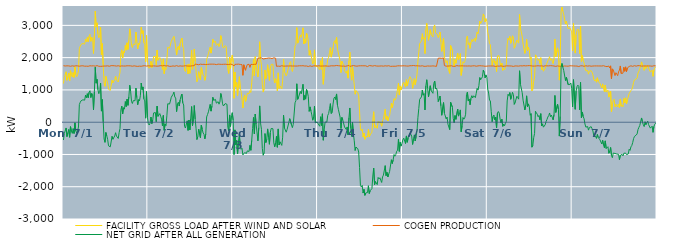
| Category | FACILITY GROSS LOAD AFTER WIND AND SOLAR | COGEN PRODUCTION | NET GRID AFTER ALL GENERATION |
|---|---|---|---|
|  Mon  7/1 | 1198 | 1751 | -553 |
|  Mon  7/1 | 1385 | 1738 | -353 |
|  Mon  7/1 | 1361 | 1741 | -380 |
|  Mon  7/1 | 1562 | 1741 | -179 |
|  Mon  7/1 | 1299 | 1746 | -447 |
|  Mon  7/1 | 1410 | 1731 | -321 |
|  Mon  7/1 | 1518 | 1744 | -226 |
|  Mon  7/1 | 1281 | 1748 | -467 |
|  Mon  7/1 | 1595 | 1733 | -138 |
|  Mon  7/1 | 1474 | 1747 | -273 |
|  Mon  7/1 | 1399 | 1746 | -347 |
|  Mon  7/1 | 1538 | 1738 | -200 |
|  Mon  7/1 | 1386 | 1736 | -350 |
|  Mon  7/1 | 1716 | 1736 | -20 |
|  Mon  7/1 | 1476 | 1748 | -272 |
|  Mon  7/1 | 1410 | 1746 | -336 |
|  Mon  7/1 | 1473 | 1745 | -272 |
|  Mon  7/1 | 1589 | 1739 | -150 |
|  Mon  7/1 | 2279 | 1734 | 545 |
|  Mon  7/1 | 2356 | 1739 | 617 |
|  Mon  7/1 | 2411 | 1745 | 666 |
|  Mon  7/1 | 2425 | 1754 | 671 |
|  Mon  7/1 | 2440 | 1747 | 693 |
|  Mon  7/1 | 2423 | 1740 | 683 |
|  Mon  7/1 | 2417 | 1735 | 682 |
|  Mon  7/1 | 2572 | 1735 | 837 |
|  Mon  7/1 | 2494 | 1736 | 758 |
|  Mon  7/1 | 2624 | 1741 | 883 |
|  Mon  7/1 | 2492 | 1732 | 760 |
|  Mon  7/1 | 2660 | 1734 | 926 |
|  Mon  7/1 | 2722 | 1748 | 974 |
|  Mon  7/1 | 2504 | 1742 | 762 |
|  Mon  7/1 | 2636 | 1743 | 893 |
|  Mon  7/1 | 2586 | 1743 | 843 |
|  Mon  7/1 | 2130 | 1747 | 383 |
|  Mon  7/1 | 2696 | 1750 | 946 |
|  Mon  7/1 | 3440 | 1736 | 1704 |
|  Mon  7/1 | 2952 | 1743 | 1209 |
|  Mon  7/1 | 3079 | 1753 | 1326 |
|  Mon  7/1 | 2740 | 1733 | 1007 |
|  Mon  7/1 | 2614 | 1732 | 882 |
|  Mon  7/1 | 2675 | 1753 | 922 |
|  Mon  7/1 | 2944 | 1730 | 1214 |
|  Mon  7/1 | 2086 | 1743 | 343 |
|  Mon  7/1 | 2435 | 1734 | 701 |
|  Mon  7/1 | 1758 | 1748 | 10 |
|  Mon  7/1 | 1218 | 1740 | -522 |
|  Mon  7/1 | 1112 | 1737 | -625 |
|  Mon  7/1 | 1420 | 1740 | -320 |
|  Mon  7/1 | 1305 | 1728 | -423 |
|  Mon  7/1 | 1215 | 1746 | -531 |
|  Mon  7/1 | 1019 | 1751 | -732 |
|  Mon  7/1 | 1001 | 1733 | -732 |
|  Mon  7/1 | 985 | 1748 | -763 |
|  Mon  7/1 | 998 | 1752 | -754 |
|  Mon  7/1 | 1300 | 1740 | -440 |
|  Mon  7/1 | 1222 | 1751 | -529 |
|  Mon  7/1 | 1217 | 1738 | -521 |
|  Mon  7/1 | 1322 | 1747 | -425 |
|  Mon  7/1 | 1422 | 1748 | -326 |
|  Mon  7/1 | 1308 | 1738 | -430 |
|  Mon  7/1 | 1297 | 1742 | -445 |
|  Mon  7/1 | 1245 | 1749 | -504 |
|  Mon  7/1 | 1421 | 1746 | -325 |
|  Mon  7/1 | 1540 | 1734 | -194 |
|  Mon  7/1 | 2126 | 1745 | 381 |
|  Mon  7/1 | 2241 | 1744 | 497 |
|  Mon  7/1 | 1992 | 1732 | 260 |
|  Mon  7/1 | 2189 | 1740 | 449 |
|  Mon  7/1 | 2144 | 1741 | 403 |
|  Mon  7/1 | 2379 | 1740 | 639 |
|  Mon  7/1 | 2231 | 1748 | 483 |
|  Mon  7/1 | 2460 | 1747 | 713 |
|  Mon  7/1 | 2255 | 1733 | 522 |
|  Mon  7/1 | 2534 | 1747 | 787 |
|  Mon  7/1 | 2892 | 1747 | 1145 |
|  Mon  7/1 | 2704 | 1745 | 959 |
|  Mon  7/1 | 2376 | 1733 | 643 |
|  Mon  7/1 | 2313 | 1734 | 579 |
|  Mon  7/1 | 2419 | 1751 | 668 |
|  Mon  7/1 | 2389 | 1746 | 643 |
|  Mon  7/1 | 2408 | 1742 | 666 |
|  Mon  7/1 | 2794 | 1736 | 1058 |
|  Mon  7/1 | 2499 | 1739 | 760 |
|  Mon  7/1 | 2269 | 1729 | 540 |
|  Mon  7/1 | 2443 | 1745 | 698 |
|  Mon  7/1 | 2397 | 1737 | 660 |
|  Mon  7/1 | 2565 | 1747 | 818 |
|  Mon  7/1 | 2944 | 1732 | 1212 |
|  Mon  7/1 | 2748 | 1738 | 1010 |
|  Mon  7/1 | 2836 | 1744 | 1092 |
|  Mon  7/1 | 2466 | 1743 | 723 |
|  Mon  7/1 | 2411 | 1751 | 660 |
|  Mon  7/1 | 1868 | 1744 | 124 |
|  Mon  7/1 | 2686 | 1737 | 949 |
|  Mon  7/1 | 1907 | 1750 | 157 |
|  Tue  7/2 | 1706 | 1747 | -41 |
|  Tue  7/2 | 1673 | 1761 | -88 |
|  Tue  7/2 | 1711 | 1741 | -30 |
|  Tue  7/2 | 1887 | 1727 | 160 |
|  Tue  7/2 | 1695 | 1739 | -44 |
|  Tue  7/2 | 1803 | 1736 | 67 |
|  Tue  7/2 | 2030 | 1744 | 286 |
|  Tue  7/2 | 2060 | 1760 | 300 |
|  Tue  7/2 | 2039 | 1740 | 299 |
|  Tue  7/2 | 1767 | 1752 | 15 |
|  Tue  7/2 | 2234 | 1736 | 498 |
|  Tue  7/2 | 1917 | 1738 | 179 |
|  Tue  7/2 | 1911 | 1740 | 171 |
|  Tue  7/2 | 2005 | 1739 | 266 |
|  Tue  7/2 | 1939 | 1752 | 187 |
|  Tue  7/2 | 1841 | 1747 | 94 |
|  Tue  7/2 | 1634 | 1745 | -111 |
|  Tue  7/2 | 1962 | 1753 | 209 |
|  Tue  7/2 | 1503 | 1755 | -252 |
|  Tue  7/2 | 1689 | 1744 | -55 |
|  Tue  7/2 | 1634 | 1742 | -108 |
|  Tue  7/2 | 1924 | 1727 | 197 |
|  Tue  7/2 | 2321 | 1749 | 572 |
|  Tue  7/2 | 2318 | 1745 | 573 |
|  Tue  7/2 | 2291 | 1730 | 561 |
|  Tue  7/2 | 2393 | 1740 | 653 |
|  Tue  7/2 | 2505 | 1732 | 773 |
|  Tue  7/2 | 2525 | 1750 | 775 |
|  Tue  7/2 | 2608 | 1743 | 865 |
|  Tue  7/2 | 2662 | 1730 | 932 |
|  Tue  7/2 | 2514 | 1734 | 780 |
|  Tue  7/2 | 2493 | 1746 | 747 |
|  Tue  7/2 | 2080 | 1752 | 328 |
|  Tue  7/2 | 2313 | 1743 | 570 |
|  Tue  7/2 | 2351 | 1732 | 619 |
|  Tue  7/2 | 2242 | 1742 | 500 |
|  Tue  7/2 | 2435 | 1745 | 690 |
|  Tue  7/2 | 2544 | 1738 | 806 |
|  Tue  7/2 | 2608 | 1737 | 871 |
|  Tue  7/2 | 2337 | 1738 | 599 |
|  Tue  7/2 | 2273 | 1740 | 533 |
|  Tue  7/2 | 1612 | 1742 | -130 |
|  Tue  7/2 | 1568 | 1749 | -181 |
|  Tue  7/2 | 1542 | 1734 | -192 |
|  Tue  7/2 | 1783 | 1741 | 42 |
|  Tue  7/2 | 1498 | 1751 | -253 |
|  Tue  7/2 | 1805 | 1738 | 67 |
|  Tue  7/2 | 1514 | 1752 | -238 |
|  Tue  7/2 | 1853 | 1739 | 114 |
|  Tue  7/2 | 2233 | 1749 | 484 |
|  Tue  7/2 | 1638 | 1749 | -111 |
|  Tue  7/2 | 1825 | 1734 | 91 |
|  Tue  7/2 | 2267 | 1751 | 516 |
|  Tue  7/2 | 1897 | 1799 | 98 |
|  Tue  7/2 | 1603 | 1792 | -189 |
|  Tue  7/2 | 1254 | 1792 | -538 |
|  Tue  7/2 | 1342 | 1790 | -448 |
|  Tue  7/2 | 1566 | 1780 | -214 |
|  Tue  7/2 | 1580 | 1793 | -213 |
|  Tue  7/2 | 1317 | 1798 | -481 |
|  Tue  7/2 | 1699 | 1790 | -91 |
|  Tue  7/2 | 1569 | 1790 | -221 |
|  Tue  7/2 | 1458 | 1793 | -335 |
|  Tue  7/2 | 1418 | 1794 | -376 |
|  Tue  7/2 | 1296 | 1813 | -517 |
|  Tue  7/2 | 1418 | 1785 | -367 |
|  Tue  7/2 | 1944 | 1782 | 162 |
|  Tue  7/2 | 2028 | 1791 | 237 |
|  Tue  7/2 | 2122 | 1801 | 321 |
|  Tue  7/2 | 2133 | 1797 | 336 |
|  Tue  7/2 | 2325 | 1775 | 550 |
|  Tue  7/2 | 2140 | 1798 | 342 |
|  Tue  7/2 | 2294 | 1789 | 505 |
|  Tue  7/2 | 2570 | 1798 | 772 |
|  Tue  7/2 | 2475 | 1797 | 678 |
|  Tue  7/2 | 2499 | 1796 | 703 |
|  Tue  7/2 | 2503 | 1798 | 705 |
|  Tue  7/2 | 2374 | 1784 | 590 |
|  Tue  7/2 | 2372 | 1795 | 577 |
|  Tue  7/2 | 2434 | 1798 | 636 |
|  Tue  7/2 | 2341 | 1783 | 558 |
|  Tue  7/2 | 2422 | 1795 | 627 |
|  Tue  7/2 | 2683 | 1794 | 889 |
|  Tue  7/2 | 2571 | 1791 | 780 |
|  Tue  7/2 | 2350 | 1780 | 570 |
|  Tue  7/2 | 2295 | 1794 | 501 |
|  Tue  7/2 | 2308 | 1788 | 520 |
|  Tue  7/2 | 2373 | 1797 | 576 |
|  Tue  7/2 | 2342 | 1793 | 549 |
|  Tue  7/2 | 2344 | 1791 | 553 |
|  Tue  7/2 | 1640 | 1798 | -158 |
|  Tue  7/2 | 1510 | 1786 | -276 |
|  Tue  7/2 | 2017 | 1793 | 224 |
|  Tue  7/2 | 1667 | 1799 | -132 |
|  Tue  7/2 | 1978 | 1775 | 203 |
|  Tue  7/2 | 2080 | 1786 | 294 |
|  Wed  7/3 | 1863 | 1799 | 64 |
|  Wed  7/3 | 739 | 1742 | -1003 |
|  Wed  7/3 | 1553 | 1791 | -238 |
|  Wed  7/3 | 1091 | 1791 | -700 |
|  Wed  7/3 | 1229 | 1795 | -566 |
|  Wed  7/3 | 824 | 1807 | -983 |
|  Wed  7/3 | 1192 | 1798 | -606 |
|  Wed  7/3 | 1409 | 1787 | -378 |
|  Wed  7/3 | 1055 | 1790 | -735 |
|  Wed  7/3 | 948 | 1788 | -840 |
|  Wed  7/3 | 975 | 1783 | -808 |
|  Wed  7/3 | 439 | 1453 | -1014 |
|  Wed  7/3 | 757 | 1779 | -1022 |
|  Wed  7/3 | 844 | 1786 | -942 |
|  Wed  7/3 | 641 | 1609 | -968 |
|  Wed  7/3 | 740 | 1710 | -970 |
|  Wed  7/3 | 894 | 1784 | -890 |
|  Wed  7/3 | 905 | 1798 | -893 |
|  Wed  7/3 | 887 | 1793 | -906 |
|  Wed  7/3 | 977 | 1696 | -719 |
|  Wed  7/3 | 921 | 1792 | -871 |
|  Wed  7/3 | 1223 | 1787 | -564 |
|  Wed  7/3 | 1590 | 1787 | -197 |
|  Wed  7/3 | 1950 | 1803 | 147 |
|  Wed  7/3 | 1431 | 1793 | -362 |
|  Wed  7/3 | 2028 | 1775 | 253 |
|  Wed  7/3 | 1731 | 1795 | -64 |
|  Wed  7/3 | 1750 | 1793 | -43 |
|  Wed  7/3 | 1401 | 1979 | -578 |
|  Wed  7/3 | 1811 | 1977 | -166 |
|  Wed  7/3 | 2492 | 1987 | 505 |
|  Wed  7/3 | 1945 | 1974 | -29 |
|  Wed  7/3 | 1775 | 1995 | -220 |
|  Wed  7/3 | 1164 | 1977 | -813 |
|  Wed  7/3 | 933 | 1956 | -1023 |
|  Wed  7/3 | 1037 | 1979 | -942 |
|  Wed  7/3 | 1616 | 1969 | -353 |
|  Wed  7/3 | 1348 | 1979 | -631 |
|  Wed  7/3 | 1444 | 1977 | -533 |
|  Wed  7/3 | 1780 | 1988 | -208 |
|  Wed  7/3 | 1523 | 1988 | -465 |
|  Wed  7/3 | 1290 | 1975 | -685 |
|  Wed  7/3 | 1663 | 1984 | -321 |
|  Wed  7/3 | 1791 | 1986 | -195 |
|  Wed  7/3 | 1781 | 1971 | -190 |
|  Wed  7/3 | 1793 | 1996 | -203 |
|  Wed  7/3 | 1351 | 1995 | -644 |
|  Wed  7/3 | 1213 | 1976 | -763 |
|  Wed  7/3 | 1349 | 1982 | -633 |
|  Wed  7/3 | 1294 | 1732 | -438 |
|  Wed  7/3 | 969 | 1747 | -778 |
|  Wed  7/3 | 1528 | 1737 | -209 |
|  Wed  7/3 | 1046 | 1753 | -707 |
|  Wed  7/3 | 1121 | 1730 | -609 |
|  Wed  7/3 | 1117 | 1744 | -627 |
|  Wed  7/3 | 1031 | 1750 | -719 |
|  Wed  7/3 | 1281 | 1745 | -464 |
|  Wed  7/3 | 1953 | 1737 | 216 |
|  Wed  7/3 | 1571 | 1750 | -179 |
|  Wed  7/3 | 1556 | 1738 | -182 |
|  Wed  7/3 | 1433 | 1744 | -311 |
|  Wed  7/3 | 1512 | 1741 | -229 |
|  Wed  7/3 | 1511 | 1748 | -237 |
|  Wed  7/3 | 1729 | 1741 | -12 |
|  Wed  7/3 | 1845 | 1736 | 109 |
|  Wed  7/3 | 1876 | 1744 | 132 |
|  Wed  7/3 | 1650 | 1731 | -81 |
|  Wed  7/3 | 1570 | 1740 | -170 |
|  Wed  7/3 | 1676 | 1743 | -67 |
|  Wed  7/3 | 1694 | 1741 | -47 |
|  Wed  7/3 | 2360 | 1759 | 601 |
|  Wed  7/3 | 2405 | 1739 | 666 |
|  Wed  7/3 | 2929 | 1739 | 1190 |
|  Wed  7/3 | 2449 | 1741 | 708 |
|  Wed  7/3 | 2518 | 1741 | 777 |
|  Wed  7/3 | 2544 | 1748 | 796 |
|  Wed  7/3 | 2703 | 1748 | 955 |
|  Wed  7/3 | 2624 | 1747 | 877 |
|  Wed  7/3 | 2751 | 1731 | 1020 |
|  Wed  7/3 | 2924 | 1750 | 1174 |
|  Wed  7/3 | 2425 | 1741 | 684 |
|  Wed  7/3 | 2566 | 1740 | 826 |
|  Wed  7/3 | 2450 | 1736 | 714 |
|  Wed  7/3 | 2758 | 1742 | 1016 |
|  Wed  7/3 | 2680 | 1746 | 934 |
|  Wed  7/3 | 2514 | 1725 | 789 |
|  Wed  7/3 | 2073 | 1739 | 334 |
|  Wed  7/3 | 2220 | 1746 | 474 |
|  Wed  7/3 | 2092 | 1747 | 345 |
|  Wed  7/3 | 1953 | 1729 | 224 |
|  Wed  7/3 | 1803 | 1742 | 61 |
|  Wed  7/3 | 1907 | 1744 | 163 |
|  Wed  7/3 | 2240 | 1745 | 495 |
|  Wed  7/3 | 1725 | 1746 | -21 |
|  Wed  7/3 | 1738 | 1740 | -2 |
|  Wed  7/3 | 1744 | 1740 | 4 |
|  Thu  7/4 | 1741 | 1733 | 8 |
|  Thu  7/4 | 1661 | 1748 | -87 |
|  Thu  7/4 | 1624 | 1751 | -127 |
|  Thu  7/4 | 1907 | 1738 | 169 |
|  Thu  7/4 | 1640 | 1743 | -103 |
|  Thu  7/4 | 2000 | 1740 | 260 |
|  Thu  7/4 | 1175 | 1734 | -559 |
|  Thu  7/4 | 1514 | 1742 | -228 |
|  Thu  7/4 | 1744 | 1741 | 3 |
|  Thu  7/4 | 1745 | 1743 | 2 |
|  Thu  7/4 | 1739 | 1736 | 3 |
|  Thu  7/4 | 1949 | 1736 | 213 |
|  Thu  7/4 | 2010 | 1745 | 265 |
|  Thu  7/4 | 2153 | 1737 | 416 |
|  Thu  7/4 | 2307 | 1733 | 574 |
|  Thu  7/4 | 2016 | 1748 | 268 |
|  Thu  7/4 | 2039 | 1740 | 299 |
|  Thu  7/4 | 2304 | 1745 | 559 |
|  Thu  7/4 | 2484 | 1741 | 743 |
|  Thu  7/4 | 2527 | 1747 | 780 |
|  Thu  7/4 | 2437 | 1736 | 701 |
|  Thu  7/4 | 2632 | 1757 | 875 |
|  Thu  7/4 | 2279 | 1751 | 528 |
|  Thu  7/4 | 2147 | 1750 | 397 |
|  Thu  7/4 | 2117 | 1730 | 387 |
|  Thu  7/4 | 1899 | 1744 | 155 |
|  Thu  7/4 | 1539 | 1735 | -196 |
|  Thu  7/4 | 1885 | 1737 | 148 |
|  Thu  7/4 | 1827 | 1758 | 69 |
|  Thu  7/4 | 1793 | 1738 | 55 |
|  Thu  7/4 | 1593 | 1741 | -148 |
|  Thu  7/4 | 1606 | 1732 | -126 |
|  Thu  7/4 | 1516 | 1744 | -228 |
|  Thu  7/4 | 1598 | 1745 | -147 |
|  Thu  7/4 | 1365 | 1758 | -393 |
|  Thu  7/4 | 1897 | 1760 | 137 |
|  Thu  7/4 | 2169 | 1729 | 440 |
|  Thu  7/4 | 1554 | 1732 | -178 |
|  Thu  7/4 | 1302 | 1742 | -440 |
|  Thu  7/4 | 1732 | 1735 | -3 |
|  Thu  7/4 | 1408 | 1756 | -348 |
|  Thu  7/4 | 1165 | 1742 | -577 |
|  Thu  7/4 | 866 | 1742 | -876 |
|  Thu  7/4 | 977 | 1748 | -771 |
|  Thu  7/4 | 966 | 1736 | -770 |
|  Thu  7/4 | 911 | 1733 | -822 |
|  Thu  7/4 | 819 | 1745 | -926 |
|  Thu  7/4 | 343 | 1748 | -1405 |
|  Thu  7/4 | -219 | 1748 | -1967 |
|  Thu  7/4 | -264 | 1741 | -2005 |
|  Thu  7/4 | -210 | 1748 | -1958 |
|  Thu  7/4 | -462 | 1734 | -2196 |
|  Thu  7/4 | -334 | 1747 | -2081 |
|  Thu  7/4 | -529 | 1738 | -2267 |
|  Thu  7/4 | -447 | 1746 | -2193 |
|  Thu  7/4 | -465 | 1740 | -2205 |
|  Thu  7/4 | -458 | 1723 | -2181 |
|  Thu  7/4 | -217 | 1753 | -1970 |
|  Thu  7/4 | -454 | 1755 | -2209 |
|  Thu  7/4 | -395 | 1728 | -2123 |
|  Thu  7/4 | -377 | 1748 | -2125 |
|  Thu  7/4 | -309 | 1747 | -2056 |
|  Thu  7/4 | 69 | 1738 | -1669 |
|  Thu  7/4 | 324 | 1747 | -1423 |
|  Thu  7/4 | -182 | 1753 | -1935 |
|  Thu  7/4 | -103 | 1736 | -1839 |
|  Thu  7/4 | -98 | 1741 | -1839 |
|  Thu  7/4 | -192 | 1743 | -1935 |
|  Thu  7/4 | 25 | 1737 | -1712 |
|  Thu  7/4 | -20 | 1738 | -1758 |
|  Thu  7/4 | 18 | 1740 | -1722 |
|  Thu  7/4 | -52 | 1750 | -1802 |
|  Thu  7/4 | -125 | 1743 | -1868 |
|  Thu  7/4 | 49 | 1746 | -1697 |
|  Thu  7/4 | 96 | 1736 | -1640 |
|  Thu  7/4 | 83 | 1745 | -1662 |
|  Thu  7/4 | 400 | 1747 | -1347 |
|  Thu  7/4 | 87 | 1743 | -1656 |
|  Thu  7/4 | 185 | 1739 | -1554 |
|  Thu  7/4 | 37 | 1735 | -1698 |
|  Thu  7/4 | 142 | 1750 | -1608 |
|  Thu  7/4 | 207 | 1733 | -1526 |
|  Thu  7/4 | 225 | 1730 | -1505 |
|  Thu  7/4 | 586 | 1750 | -1164 |
|  Thu  7/4 | 451 | 1733 | -1282 |
|  Thu  7/4 | 577 | 1747 | -1170 |
|  Thu  7/4 | 733 | 1734 | -1001 |
|  Thu  7/4 | 680 | 1735 | -1055 |
|  Thu  7/4 | 732 | 1734 | -1002 |
|  Thu  7/4 | 852 | 1755 | -903 |
|  Thu  7/4 | 879 | 1746 | -867 |
|  Thu  7/4 | 1208 | 1738 | -530 |
|  Thu  7/4 | 842 | 1747 | -905 |
|  Thu  7/4 | 1123 | 1747 | -624 |
|  Thu  7/4 | 1002 | 1743 | -741 |
|  Thu  7/4 | 1099 | 1752 | -653 |
|  Fri  7/5 | 1200 | 1747 | -547 |
|  Fri  7/5 | 1235 | 1731 | -496 |
|  Fri  7/5 | 1235 | 1746 | -511 |
|  Fri  7/5 | 1086 | 1746 | -660 |
|  Fri  7/5 | 1315 | 1741 | -426 |
|  Fri  7/5 | 1120 | 1743 | -623 |
|  Fri  7/5 | 1265 | 1738 | -473 |
|  Fri  7/5 | 1287 | 1747 | -460 |
|  Fri  7/5 | 1411 | 1749 | -338 |
|  Fri  7/5 | 1357 | 1732 | -375 |
|  Fri  7/5 | 1322 | 1750 | -428 |
|  Fri  7/5 | 1050 | 1740 | -690 |
|  Fri  7/5 | 1240 | 1756 | -516 |
|  Fri  7/5 | 1349 | 1742 | -393 |
|  Fri  7/5 | 1164 | 1747 | -583 |
|  Fri  7/5 | 1306 | 1738 | -432 |
|  Fri  7/5 | 1482 | 1747 | -265 |
|  Fri  7/5 | 1884 | 1747 | 137 |
|  Fri  7/5 | 2166 | 1743 | 423 |
|  Fri  7/5 | 2438 | 1730 | 708 |
|  Fri  7/5 | 2427 | 1739 | 688 |
|  Fri  7/5 | 2517 | 1735 | 782 |
|  Fri  7/5 | 2743 | 1748 | 995 |
|  Fri  7/5 | 2572 | 1737 | 835 |
|  Fri  7/5 | 2618 | 1731 | 887 |
|  Fri  7/5 | 2126 | 1747 | 379 |
|  Fri  7/5 | 2857 | 1732 | 1125 |
|  Fri  7/5 | 3061 | 1746 | 1315 |
|  Fri  7/5 | 2796 | 1742 | 1054 |
|  Fri  7/5 | 2538 | 1753 | 785 |
|  Fri  7/5 | 2514 | 1738 | 776 |
|  Fri  7/5 | 2866 | 1738 | 1128 |
|  Fri  7/5 | 2714 | 1739 | 975 |
|  Fri  7/5 | 2700 | 1733 | 967 |
|  Fri  7/5 | 2639 | 1744 | 895 |
|  Fri  7/5 | 2953 | 1748 | 1205 |
|  Fri  7/5 | 3013 | 1738 | 1275 |
|  Fri  7/5 | 2772 | 1743 | 1029 |
|  Fri  7/5 | 2789 | 1729 | 1060 |
|  Fri  7/5 | 2716 | 1752 | 964 |
|  Fri  7/5 | 2620 | 1982 | 638 |
|  Fri  7/5 | 2701 | 1981 | 720 |
|  Fri  7/5 | 2795 | 1985 | 810 |
|  Fri  7/5 | 2490 | 1983 | 507 |
|  Fri  7/5 | 2194 | 1980 | 214 |
|  Fri  7/5 | 2193 | 1979 | 214 |
|  Fri  7/5 | 2597 | 1991 | 606 |
|  Fri  7/5 | 2026 | 1754 | 272 |
|  Fri  7/5 | 1930 | 1738 | 192 |
|  Fri  7/5 | 1836 | 1735 | 101 |
|  Fri  7/5 | 1904 | 1746 | 158 |
|  Fri  7/5 | 1677 | 1739 | -62 |
|  Fri  7/5 | 1707 | 1751 | -44 |
|  Fri  7/5 | 1511 | 1743 | -232 |
|  Fri  7/5 | 2375 | 1757 | 618 |
|  Fri  7/5 | 2378 | 1748 | 630 |
|  Fri  7/5 | 2218 | 1753 | 465 |
|  Fri  7/5 | 1840 | 1729 | 111 |
|  Fri  7/5 | 1730 | 1747 | -17 |
|  Fri  7/5 | 1938 | 1732 | 206 |
|  Fri  7/5 | 1824 | 1737 | 87 |
|  Fri  7/5 | 1821 | 1753 | 68 |
|  Fri  7/5 | 2140 | 1734 | 406 |
|  Fri  7/5 | 1930 | 1743 | 187 |
|  Fri  7/5 | 1994 | 1745 | 249 |
|  Fri  7/5 | 2124 | 1744 | 380 |
|  Fri  7/5 | 1451 | 1747 | -296 |
|  Fri  7/5 | 1640 | 1747 | -107 |
|  Fri  7/5 | 1875 | 1729 | 146 |
|  Fri  7/5 | 1834 | 1742 | 92 |
|  Fri  7/5 | 1874 | 1739 | 135 |
|  Fri  7/5 | 1989 | 1742 | 247 |
|  Fri  7/5 | 2612 | 1754 | 858 |
|  Fri  7/5 | 2671 | 1740 | 931 |
|  Fri  7/5 | 2404 | 1749 | 655 |
|  Fri  7/5 | 2462 | 1743 | 719 |
|  Fri  7/5 | 2286 | 1746 | 540 |
|  Fri  7/5 | 2476 | 1737 | 739 |
|  Fri  7/5 | 2562 | 1741 | 821 |
|  Fri  7/5 | 2496 | 1745 | 751 |
|  Fri  7/5 | 2546 | 1728 | 818 |
|  Fri  7/5 | 2594 | 1748 | 846 |
|  Fri  7/5 | 2505 | 1744 | 761 |
|  Fri  7/5 | 2630 | 1734 | 896 |
|  Fri  7/5 | 2795 | 1746 | 1049 |
|  Fri  7/5 | 2737 | 1744 | 993 |
|  Fri  7/5 | 2883 | 1751 | 1132 |
|  Fri  7/5 | 3132 | 1750 | 1382 |
|  Fri  7/5 | 3060 | 1741 | 1319 |
|  Fri  7/5 | 3099 | 1745 | 1354 |
|  Fri  7/5 | 3156 | 1748 | 1408 |
|  Fri  7/5 | 3355 | 1741 | 1614 |
|  Fri  7/5 | 3286 | 1747 | 1539 |
|  Fri  7/5 | 3105 | 1733 | 1372 |
|  Fri  7/5 | 3208 | 1743 | 1465 |
|  Fri  7/5 | 3125 | 1736 | 1389 |
|  Sat  7/6 | 2779 | 1751 | 1028 |
|  Sat  7/6 | 2645 | 1742 | 903 |
|  Sat  7/6 | 2433 | 1746 | 687 |
|  Sat  7/6 | 2398 | 1742 | 656 |
|  Sat  7/6 | 2064 | 1737 | 327 |
|  Sat  7/6 | 1757 | 1741 | 16 |
|  Sat  7/6 | 1906 | 1734 | 172 |
|  Sat  7/6 | 1961 | 1740 | 221 |
|  Sat  7/6 | 1821 | 1749 | 72 |
|  Sat  7/6 | 1881 | 1726 | 155 |
|  Sat  7/6 | 1571 | 1748 | -177 |
|  Sat  7/6 | 2021 | 1740 | 281 |
|  Sat  7/6 | 2075 | 1745 | 330 |
|  Sat  7/6 | 2018 | 1736 | 282 |
|  Sat  7/6 | 1840 | 1743 | 97 |
|  Sat  7/6 | 1726 | 1745 | -19 |
|  Sat  7/6 | 1826 | 1737 | 89 |
|  Sat  7/6 | 1604 | 1732 | -128 |
|  Sat  7/6 | 1666 | 1724 | -58 |
|  Sat  7/6 | 1622 | 1734 | -112 |
|  Sat  7/6 | 1706 | 1740 | -34 |
|  Sat  7/6 | 1763 | 1745 | 18 |
|  Sat  7/6 | 2401 | 1743 | 658 |
|  Sat  7/6 | 2609 | 1744 | 865 |
|  Sat  7/6 | 2548 | 1729 | 819 |
|  Sat  7/6 | 2661 | 1743 | 918 |
|  Sat  7/6 | 2445 | 1735 | 710 |
|  Sat  7/6 | 2543 | 1740 | 803 |
|  Sat  7/6 | 2676 | 1750 | 926 |
|  Sat  7/6 | 2584 | 1728 | 856 |
|  Sat  7/6 | 2291 | 1738 | 553 |
|  Sat  7/6 | 2356 | 1743 | 613 |
|  Sat  7/6 | 2385 | 1745 | 640 |
|  Sat  7/6 | 2545 | 1741 | 804 |
|  Sat  7/6 | 2496 | 1738 | 758 |
|  Sat  7/6 | 2450 | 1737 | 713 |
|  Sat  7/6 | 3337 | 1744 | 1593 |
|  Sat  7/6 | 2923 | 1748 | 1175 |
|  Sat  7/6 | 2943 | 1751 | 1192 |
|  Sat  7/6 | 2657 | 1743 | 914 |
|  Sat  7/6 | 2420 | 1738 | 682 |
|  Sat  7/6 | 2449 | 1751 | 698 |
|  Sat  7/6 | 2131 | 1751 | 380 |
|  Sat  7/6 | 2268 | 1744 | 524 |
|  Sat  7/6 | 2567 | 1750 | 817 |
|  Sat  7/6 | 2223 | 1750 | 473 |
|  Sat  7/6 | 2319 | 1752 | 567 |
|  Sat  7/6 | 2245 | 1753 | 492 |
|  Sat  7/6 | 1954 | 1740 | 214 |
|  Sat  7/6 | 2013 | 1747 | 266 |
|  Sat  7/6 | 969 | 1743 | -774 |
|  Sat  7/6 | 1019 | 1738 | -719 |
|  Sat  7/6 | 1266 | 1748 | -482 |
|  Sat  7/6 | 1388 | 1738 | -350 |
|  Sat  7/6 | 2086 | 1746 | 340 |
|  Sat  7/6 | 2032 | 1743 | 289 |
|  Sat  7/6 | 1980 | 1731 | 249 |
|  Sat  7/6 | 1918 | 1749 | 169 |
|  Sat  7/6 | 1950 | 1742 | 208 |
|  Sat  7/6 | 1815 | 1742 | 73 |
|  Sat  7/6 | 1997 | 1733 | 264 |
|  Sat  7/6 | 1628 | 1746 | -118 |
|  Sat  7/6 | 1703 | 1754 | -51 |
|  Sat  7/6 | 1578 | 1733 | -155 |
|  Sat  7/6 | 1579 | 1746 | -167 |
|  Sat  7/6 | 1667 | 1748 | -81 |
|  Sat  7/6 | 1757 | 1737 | 20 |
|  Sat  7/6 | 1828 | 1745 | 83 |
|  Sat  7/6 | 1896 | 1737 | 159 |
|  Sat  7/6 | 1949 | 1745 | 204 |
|  Sat  7/6 | 2031 | 1746 | 285 |
|  Sat  7/6 | 1920 | 1751 | 169 |
|  Sat  7/6 | 1967 | 1745 | 222 |
|  Sat  7/6 | 1979 | 1747 | 232 |
|  Sat  7/6 | 1814 | 1742 | 72 |
|  Sat  7/6 | 1974 | 1740 | 234 |
|  Sat  7/6 | 2569 | 1741 | 828 |
|  Sat  7/6 | 2031 | 1729 | 302 |
|  Sat  7/6 | 2029 | 1739 | 290 |
|  Sat  7/6 | 2303 | 1744 | 559 |
|  Sat  7/6 | 2151 | 1759 | 392 |
|  Sat  7/6 | 1304 | 1735 | -431 |
|  Sat  7/6 | 1909 | 1728 | 181 |
|  Sat  7/6 | 3443 | 1734 | 1709 |
|  Sat  7/6 | 3566 | 1746 | 1820 |
|  Sat  7/6 | 3438 | 1736 | 1702 |
|  Sat  7/6 | 3334 | 1736 | 1598 |
|  Sat  7/6 | 3348 | 1741 | 1607 |
|  Sat  7/6 | 3044 | 1754 | 1290 |
|  Sat  7/6 | 3130 | 1737 | 1393 |
|  Sat  7/6 | 3148 | 1742 | 1406 |
|  Sat  7/6 | 2898 | 1735 | 1163 |
|  Sat  7/6 | 2876 | 1737 | 1139 |
|  Sat  7/6 | 2920 | 1748 | 1172 |
|  Sat  7/6 | 2939 | 1727 | 1212 |
|  Sat  7/6 | 2800 | 1746 | 1054 |
|  Sun  7/7 | 2205 | 1732 | 473 |
|  Sun  7/7 | 3061 | 1743 | 1318 |
|  Sun  7/7 | 3034 | 1733 | 1301 |
|  Sun  7/7 | 2140 | 1740 | 400 |
|  Sun  7/7 | 2712 | 1747 | 965 |
|  Sun  7/7 | 2839 | 1739 | 1100 |
|  Sun  7/7 | 2887 | 1740 | 1147 |
|  Sun  7/7 | 2830 | 1724 | 1106 |
|  Sun  7/7 | 2127 | 1744 | 383 |
|  Sun  7/7 | 2977 | 1746 | 1231 |
|  Sun  7/7 | 1883 | 1751 | 132 |
|  Sun  7/7 | 2063 | 1747 | 316 |
|  Sun  7/7 | 1919 | 1746 | 173 |
|  Sun  7/7 | 1840 | 1732 | 108 |
|  Sun  7/7 | 1680 | 1737 | -57 |
|  Sun  7/7 | 1594 | 1748 | -154 |
|  Sun  7/7 | 1570 | 1742 | -172 |
|  Sun  7/7 | 1602 | 1737 | -135 |
|  Sun  7/7 | 1488 | 1735 | -247 |
|  Sun  7/7 | 1580 | 1746 | -166 |
|  Sun  7/7 | 1567 | 1752 | -185 |
|  Sun  7/7 | 1594 | 1734 | -140 |
|  Sun  7/7 | 1548 | 1747 | -199 |
|  Sun  7/7 | 1468 | 1740 | -272 |
|  Sun  7/7 | 1320 | 1742 | -422 |
|  Sun  7/7 | 1283 | 1743 | -460 |
|  Sun  7/7 | 1322 | 1747 | -425 |
|  Sun  7/7 | 1238 | 1743 | -505 |
|  Sun  7/7 | 1376 | 1754 | -378 |
|  Sun  7/7 | 1268 | 1742 | -474 |
|  Sun  7/7 | 1245 | 1740 | -495 |
|  Sun  7/7 | 1195 | 1742 | -547 |
|  Sun  7/7 | 1200 | 1738 | -538 |
|  Sun  7/7 | 1064 | 1740 | -676 |
|  Sun  7/7 | 1186 | 1744 | -558 |
|  Sun  7/7 | 1045 | 1750 | -705 |
|  Sun  7/7 | 947 | 1737 | -790 |
|  Sun  7/7 | 1151 | 1730 | -579 |
|  Sun  7/7 | 933 | 1749 | -816 |
|  Sun  7/7 | 909 | 1722 | -813 |
|  Sun  7/7 | 992 | 1752 | -760 |
|  Sun  7/7 | 776 | 1740 | -964 |
|  Sun  7/7 | 781 | 1678 | -897 |
|  Sun  7/7 | 963 | 1746 | -783 |
|  Sun  7/7 | 317 | 1349 | -1032 |
|  Sun  7/7 | 552 | 1653 | -1101 |
|  Sun  7/7 | 664 | 1621 | -957 |
|  Sun  7/7 | 710 | 1649 | -939 |
|  Sun  7/7 | 474 | 1443 | -969 |
|  Sun  7/7 | 553 | 1533 | -980 |
|  Sun  7/7 | 504 | 1489 | -985 |
|  Sun  7/7 | 470 | 1441 | -971 |
|  Sun  7/7 | 562 | 1558 | -996 |
|  Sun  7/7 | 454 | 1614 | -1160 |
|  Sun  7/7 | 715 | 1742 | -1027 |
|  Sun  7/7 | 490 | 1508 | -1018 |
|  Sun  7/7 | 528 | 1526 | -998 |
|  Sun  7/7 | 475 | 1519 | -1044 |
|  Sun  7/7 | 738 | 1701 | -963 |
|  Sun  7/7 | 598 | 1577 | -979 |
|  Sun  7/7 | 756 | 1714 | -958 |
|  Sun  7/7 | 565 | 1569 | -1004 |
|  Sun  7/7 | 697 | 1681 | -984 |
|  Sun  7/7 | 698 | 1684 | -986 |
|  Sun  7/7 | 888 | 1726 | -838 |
|  Sun  7/7 | 874 | 1747 | -873 |
|  Sun  7/7 | 982 | 1747 | -765 |
|  Sun  7/7 | 1015 | 1738 | -723 |
|  Sun  7/7 | 1097 | 1730 | -633 |
|  Sun  7/7 | 1235 | 1746 | -511 |
|  Sun  7/7 | 1309 | 1751 | -442 |
|  Sun  7/7 | 1335 | 1754 | -419 |
|  Sun  7/7 | 1337 | 1736 | -399 |
|  Sun  7/7 | 1370 | 1733 | -363 |
|  Sun  7/7 | 1523 | 1753 | -230 |
|  Sun  7/7 | 1579 | 1739 | -160 |
|  Sun  7/7 | 1645 | 1750 | -105 |
|  Sun  7/7 | 1642 | 1731 | -89 |
|  Sun  7/7 | 1868 | 1737 | 131 |
|  Sun  7/7 | 1758 | 1744 | 14 |
|  Sun  7/7 | 1662 | 1742 | -80 |
|  Sun  7/7 | 1603 | 1740 | -137 |
|  Sun  7/7 | 1753 | 1741 | 12 |
|  Sun  7/7 | 1663 | 1742 | -79 |
|  Sun  7/7 | 1735 | 1741 | -6 |
|  Sun  7/7 | 1772 | 1741 | 31 |
|  Sun  7/7 | 1666 | 1743 | -77 |
|  Sun  7/7 | 1671 | 1751 | -80 |
|  Sun  7/7 | 1557 | 1741 | -184 |
|  Sun  7/7 | 1543 | 1732 | -189 |
|  Sun  7/7 | 1610 | 1734 | -124 |
|  Sun  7/7 | 1421 | 1735 | -314 |
|  Sun  7/7 | 1617 | 1749 | -132 |
|  Sun  7/7 | 1683 | 1747 | -64 |
|  Sun  7/7 | 1715 | 1745 | -30 |
|  Sun  7/7 | 1705 | 1752 | -47 |